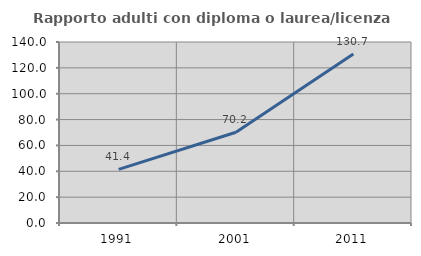
| Category | Rapporto adulti con diploma o laurea/licenza media  |
|---|---|
| 1991.0 | 41.429 |
| 2001.0 | 70.213 |
| 2011.0 | 130.732 |